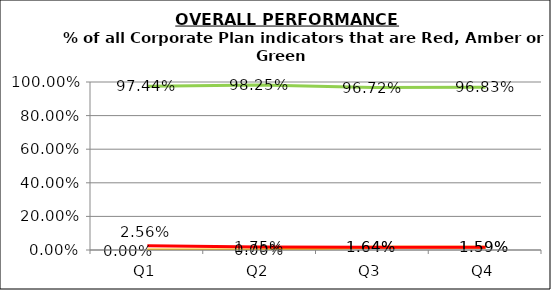
| Category | Green | Amber | Red |
|---|---|---|---|
| Q1 | 0.974 | 0 | 0.026 |
| Q2 | 0.982 | 0 | 0.018 |
| Q3 | 0.967 | 0.016 | 0.016 |
| Q4 | 0.968 | 0.016 | 0.016 |